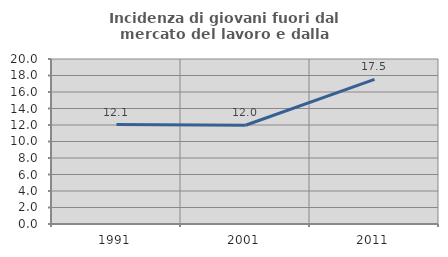
| Category | Incidenza di giovani fuori dal mercato del lavoro e dalla formazione  |
|---|---|
| 1991.0 | 12.06 |
| 2001.0 | 11.974 |
| 2011.0 | 17.538 |